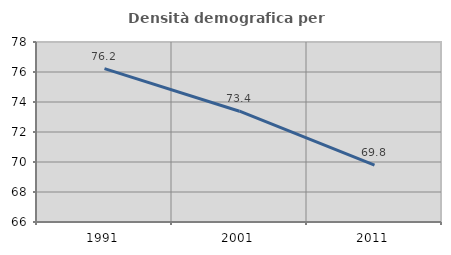
| Category | Densità demografica |
|---|---|
| 1991.0 | 76.227 |
| 2001.0 | 73.386 |
| 2011.0 | 69.788 |